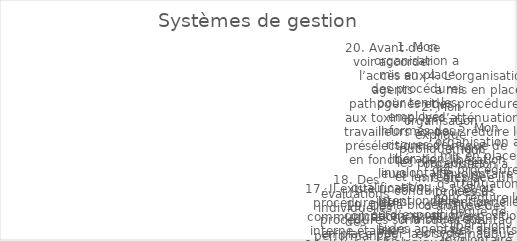
| Category | Series 0 |
|---|---|
| 1. Mon organisation a mis en place des procédures pour tenir les employés informés des risques de libération involontaire et/ou intentionnelle ou d’exposition à des agents biologiques et/ou à des toxines qui sont stockés ou manipulés dans nos installation | 3 |
| 2. Mon organisation explique publiquement les procédures et les règles de conduite liées à la biosécurité et à la biosûreté lors de l’orientation des nouveaux employés. | 0 |
| 3. Mon organisation a mis en place un processus d’analyse des risques-avantages systématique pour la recherche à double usage. | 5 |
| 4. L’organisation a mis en place des procédures d’atténuation pour réduire le risque de libération involontaire et/ou intentionnelle ou d’exposition à des agents biologiques et/ou des toxines stockés ou manipulés dans mon installation. | 2 |
| 5. Mon organisation a mis en place des procédures d’atténuation pour réduire le risque de libération involontaire et/ou intentionnelle ou d’exposition à des agents biologiques et/ou à des toxines stockés ou manipulés dans nos installations. | 2 |
| 6. Mon organisation a mis en place des procédures qui détaillent les actions requises lors d’un incident. | 0 |
| 7. Les leçons tirées des exercices d’urgence ont amélioré les performances organisationnelles. | 1 |
| 8. Mon organisation organise régulièrement des exercices d’intervention d’urgence. | 1 |
| 9. Il existe une liste à jour du personnel ayant un accès autorisé aux agents biologiques. | 1 |
| 10. L’utilisation des enseignements tirés des exercices d’urgence a amélioré les performances organisationnelles. | 3 |
| 11. Il existe une procédure permettant aux employés de signaler un comportement inhabituel à l’égard d’un collègue. | 3 |
| 12. L’utilisation des enseignements tirés des violations de la biosécurité/biosûreté ou des quasi-accidents a amélioré les performances organisationnelles. | 2 |
| 13. Il existe une liste disponible et à jour du personnel autorisé à accéder aux agents biologiques. | 2 |
| 14.  L’organisation a une formation continue en matière de biosécurité et de biosûreté et une formation axée sur les compétences pour les employés. | 0 |
| 15. Les informations concernant les mesures, procédures et politiques de biosécurité et de biosûreté sont facilement accessibles aux employés. | 4 |
| 16. Il existe une procédure permettant aux employés de signaler le comportement inhabituel d’un collègue. | 3 |
| 17. Il existe une procédure de communication interne établie pour informer les employés des incidents de biosécurité et de biosûreté et des quasi-accidents. | 1 |
| 18. Des évaluations individuelles des performances en matière de biosécurité/biosûreté ont lieu régulièrement. | 0 |
| 19. Des procédures sont en place pour la décontamination et la gestion des déchets. | 1 |
| 20. Avant de se voir accorder l’accès aux agents pathogènes et aux toxines, les travailleurs sont présélectionnés en fonction de leurs qualifications, leurs compétences et leurs caractéristiques personnelles appropriées pour le poste, et ainsi ils sont dé | 4 |